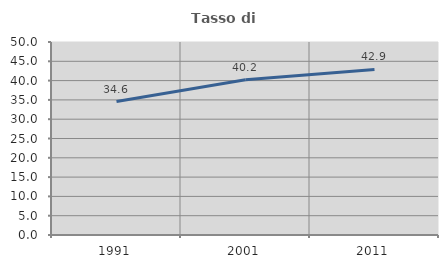
| Category | Tasso di occupazione   |
|---|---|
| 1991.0 | 34.578 |
| 2001.0 | 40.194 |
| 2011.0 | 42.905 |